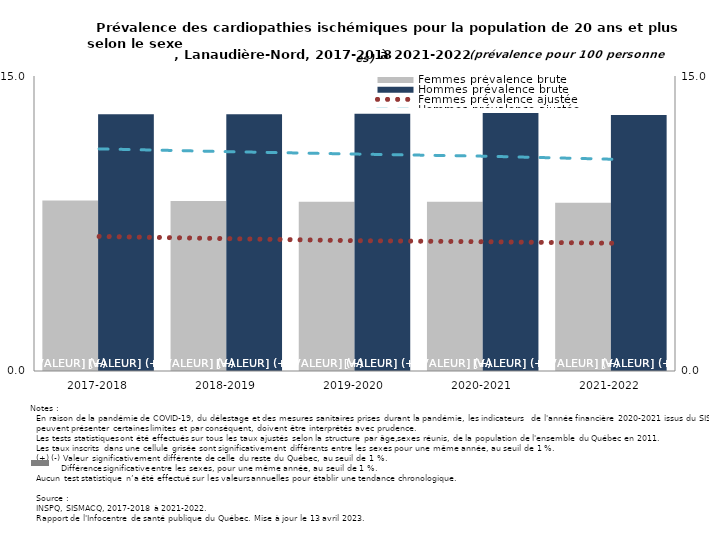
| Category | Femmes prévalence brute | Hommes prévalence brute |
|---|---|---|
| 2017-2018 | 8.666 | 13.055 |
| 2018-2019 | 8.649 | 13.059 |
| 2019-2020 | 8.606 | 13.08 |
| 2020-2021 | 8.612 | 13.124 |
| 2021-2022 | 8.558 | 13.013 |